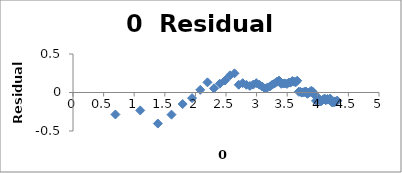
| Category | Series 0 |
|---|---|
| 0.6931471805599453 | -0.285 |
| 1.0986122886681098 | -0.233 |
| 1.3862943611198906 | -0.404 |
| 1.6094379124341003 | -0.288 |
| 1.791759469228055 | -0.15 |
| 1.9459101490553132 | -0.073 |
| 2.0794415416798357 | 0.034 |
| 2.1972245773362196 | 0.132 |
| 2.302585092994046 | 0.053 |
| 2.3978952727983707 | 0.114 |
| 2.4849066497880004 | 0.156 |
| 2.5649493574615367 | 0.223 |
| 2.6390573296152584 | 0.249 |
| 2.70805020110221 | 0.101 |
| 2.772588722239781 | 0.121 |
| 2.833213344056216 | 0.1 |
| 2.8903717578961645 | 0.086 |
| 2.9444389791664403 | 0.102 |
| 2.995732273553991 | 0.122 |
| 3.044522437723423 | 0.102 |
| 3.091042453358316 | 0.078 |
| 3.1354942159291497 | 0.053 |
| 3.1780538303479458 | 0.066 |
| 3.2188758248682006 | 0.079 |
| 3.258096538021482 | 0.103 |
| 3.295836866004329 | 0.119 |
| 3.332204510175204 | 0.139 |
| 3.367295829986474 | 0.155 |
| 3.4011973816621555 | 0.113 |
| 3.4339872044851463 | 0.116 |
| 3.4657359027997265 | 0.118 |
| 3.4965075614664802 | 0.111 |
| 3.5263605246161616 | 0.129 |
| 3.5553480614894135 | 0.128 |
| 3.58351893845611 | 0.149 |
| 3.6109179126442243 | 0.14 |
| 3.6375861597263857 | 0.132 |
| 3.6635616461296463 | 0.153 |
| 3.6888794541139363 | 0.01 |
| 3.713572066704308 | 0.01 |
| 3.7376696182833684 | -0.002 |
| 3.7612001156935624 | 0.003 |
| 3.784189633918261 | 0.007 |
| 3.8066624897703196 | 0.013 |
| 3.828641396489095 | -0.017 |
| 3.8501476017100584 | -0.007 |
| 3.871201010907891 | 0.005 |
| 3.8918202981106265 | 0.021 |
| 3.912023005428146 | 0.014 |
| 3.9318256327243257 | -0.02 |
| 3.9512437185814275 | -0.025 |
| 3.970291913552122 | -0.108 |
| 3.9889840465642745 | -0.1 |
| 4.007333185232471 | -0.089 |
| 4.02535169073515 | -0.084 |
| 4.04305126783455 | -0.116 |
| 4.060443010546419 | -0.11 |
| 4.07753744390572 | -0.096 |
| 4.0943445622221 | -0.091 |
| 4.110873864173311 | -0.078 |
| 4.127134385045092 | -0.099 |
| 4.143134726391533 | -0.095 |
| 4.1588830833596715 | -0.084 |
| 4.174387269895637 | -0.092 |
| 4.189654742026425 | -0.085 |
| 4.204692619390966 | -0.08 |
| 4.219507705176107 | -0.115 |
| 4.23410650459726 | -0.128 |
| 4.248495242049359 | -0.123 |
| 4.2626798770413155 | -0.127 |
| 4.276666119016055 | -0.116 |
| 4.290459441148391 | -0.12 |
| 4.30406509320417 | -0.115 |
| 4.31748811353631 | -0.105 |